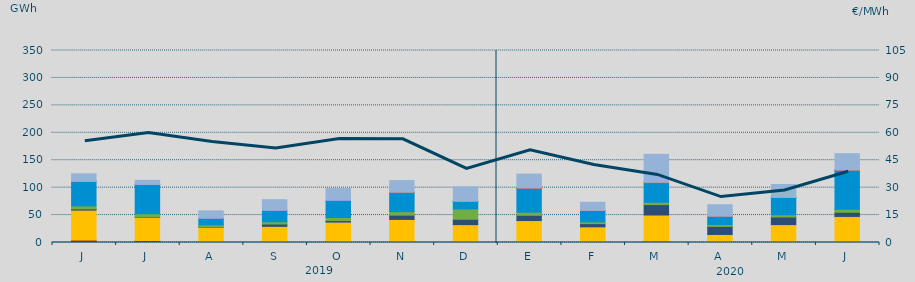
| Category | Carbón | Ciclo Combinado | Cogeneración | Consumo Bombeo | Eólica | Hidráulica | Nuclear | Otras Renovables | Solar fotovoltaica | Solar térmica | Turbinación bombeo |
|---|---|---|---|---|---|---|---|---|---|---|---|
| J | 4465.4 | 54530.5 | 0 | 2188.8 | 5586 | 44612.2 | 174.7 | 1.4 | 0 | 0 | 13701.1 |
| J | 3289.6 | 42570.7 | 0 | 636.6 | 5909.9 | 53272.1 | 42.5 | 0 | 0 | 0 | 7519.8 |
| A | 446.5 | 27502.9 | 0 | 624.2 | 3670.3 | 11750 | 1 | 0 | 0 | 0 | 13635.5 |
| S | 460.6 | 28967.7 | 0 | 4234.7 | 4105.5 | 21199.2 | 0 | 2.6 | 0 | 0 | 19063.6 |
| O | 1718.2 | 35506.1 | 18 | 2744.7 | 5556.7 | 31702.3 | 0 | 0.8 | 0 | 0 | 21165.2 |
| N | 1857.3 | 40203.9 | 0 | 7774.6 | 6415.7 | 35320.4 | 90 | 0 | 4.8 | 0 | 21237.9 |
| D | 554 | 31978.8 | 44.6 | 9751.3 | 18898.5 | 13540.8 | 366.6 | 0 | 2.1 | 0 | 26259.7 |
| E | 1376.4 | 38547.2 | 103.6 | 9542.6 | 5736.2 | 43797.8 | 0.3 | 0 | 1.3 | 1 | 25589.5 |
| F | 1350.5 | 27202.4 | 33.6 | 5812.5 | 3281.1 | 20532.5 | 140 | 103.7 | 7.4 | 0 | 14830 |
| M | 2245.9 | 47824.7 | 73.5 | 18946.1 | 4359.7 | 35788.8 | 0 | 674.6 | 8.2 | 0 | 50742.6 |
| A | 0 | 14386.3 | 255.3 | 14671.4 | 3599.9 | 14970.4 | 0 | 474.6 | 1.7 | 0 | 20437.2 |
| M | 0 | 31710.8 | 991.1 | 13782.9 | 4057.5 | 31461.1 | 16.4 | 257 | 5.9 | 0 | 23468.1 |
| J | 82.3 | 46358.8 | 1092.1 | 7553.9 | 5342.6 | 71363.3 | 488.9 | 0.6 | 15.1 | 0 | 29619.5 |